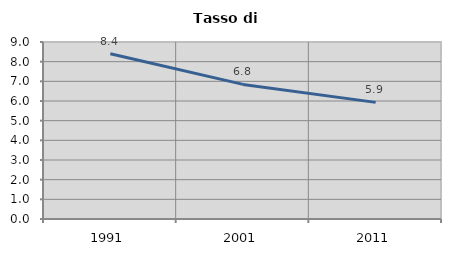
| Category | Tasso di disoccupazione   |
|---|---|
| 1991.0 | 8.401 |
| 2001.0 | 6.845 |
| 2011.0 | 5.93 |